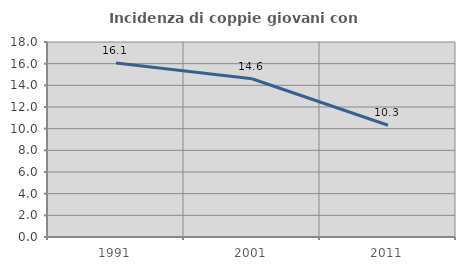
| Category | Incidenza di coppie giovani con figli |
|---|---|
| 1991.0 | 16.056 |
| 2001.0 | 14.611 |
| 2011.0 | 10.315 |